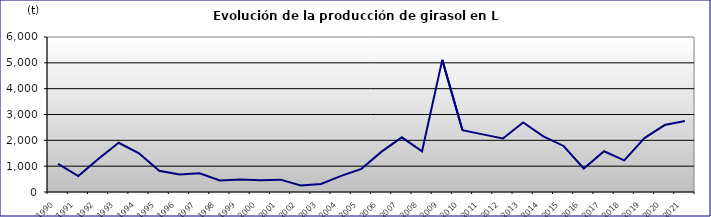
| Category | PRODUCCIÓN  (t) |
|---|---|
| 1990.0 | 1092 |
| 1991.0 | 615 |
| 1992.0 | 1287 |
| 1993.0 | 1905 |
| 1994.0 | 1497 |
| 1995.0 | 823 |
| 1996.0 | 676 |
| 1997.0 | 725 |
| 1998.0 | 442.7 |
| 1999.0 | 482.1 |
| 2000.0 | 453.9 |
| 2001.0 | 478.42 |
| 2002.0 | 253 |
| 2003.0 | 308 |
| 2004.0 | 623 |
| 2005.0 | 895 |
| 2006.0 | 1562 |
| 2007.0 | 2117 |
| 2008.0 | 1575 |
| 2009.0 | 5115 |
| 2010.0 | 2393 |
| 2011.0 | 2230 |
| 2012.0 | 2072 |
| 2013.0 | 2689 |
| 2014.0 | 2151 |
| 2015.0 | 1782 |
| 2016.0 | 910 |
| 2017.0 | 1576 |
| 2018.0 | 1225 |
| 2019.0 | 2089 |
| 2020.0 | 2592 |
| 2021.0 | 2752 |